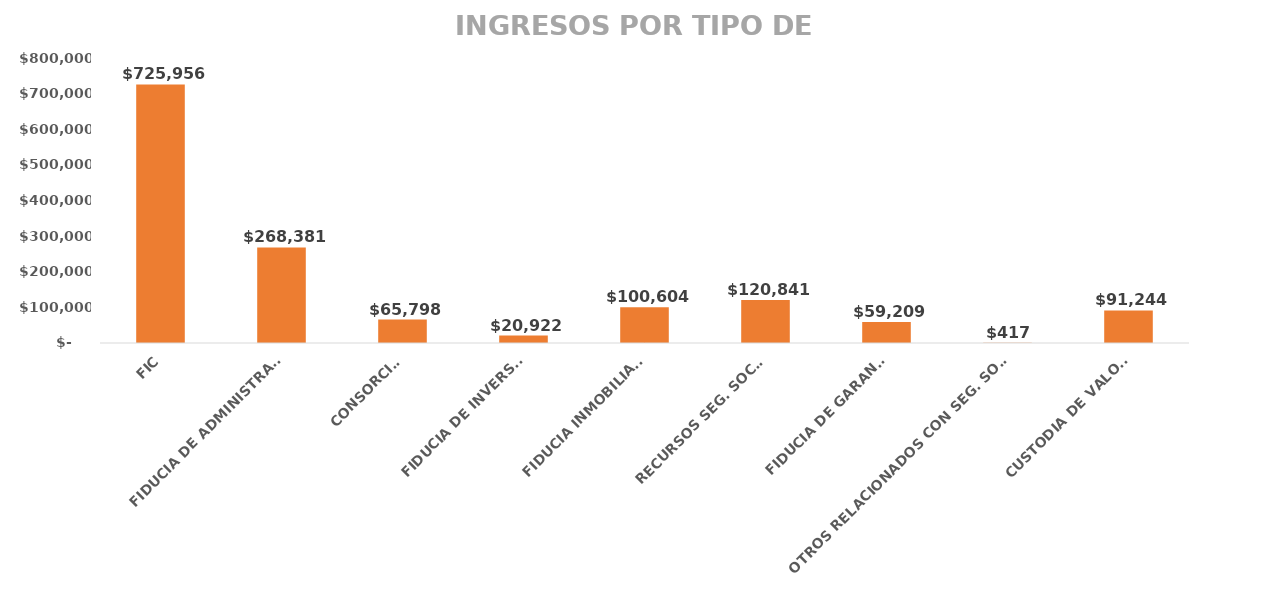
| Category | Series 0 |
|---|---|
| FIC | 725956.18 |
| FIDUCIA DE ADMINISTRACIÓN | 268381.433 |
| CONSORCIOS | 65798.25 |
| FIDUCIA DE INVERSION | 20922.068 |
| FIDUCIA INMOBILIARIA | 100603.683 |
| RECURSOS SEG. SOCIAL | 120841.178 |
| FIDUCIA DE GARANTIA | 59209.071 |
| OTROS RELACIONADOS CON SEG. SOCIAL  | 416.68 |
| CUSTODIA DE VALORES | 91243.63 |